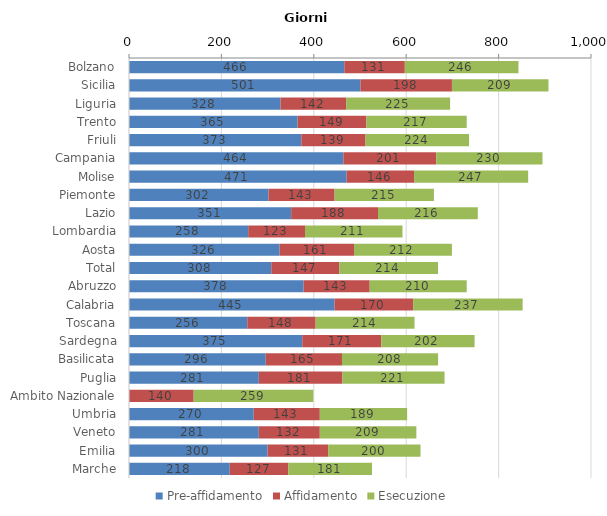
| Category | Pre-affidamento | Affidamento | Esecuzione |
|---|---|---|---|
| Bolzano | 466 | 131 | 246 |
| Sicilia | 501 | 198 | 209 |
| Liguria | 328 | 142 | 225 |
| Trento | 365 | 149 | 217 |
| Friuli | 373 | 139 | 224 |
| Campania | 464 | 201 | 230 |
| Molise | 471 | 146 | 247 |
| Piemonte | 302 | 143 | 215 |
| Lazio | 351 | 188 | 216 |
| Lombardia | 258 | 123 | 211 |
| Aosta | 326 | 161 | 212 |
| Total | 308 | 147 | 214 |
| Abruzzo | 378 | 143 | 210 |
| Calabria | 445 | 170 | 237 |
| Toscana | 256 | 148 | 214 |
| Sardegna | 375 | 171 | 202 |
| Basilicata | 296 | 165 | 208 |
| Puglia | 281 | 181 | 221 |
| Ambito Nazionale | 0 | 140 | 259 |
| Umbria | 270 | 143 | 189 |
| Veneto | 281 | 132 | 209 |
| Emilia | 300 | 131 | 200 |
| Marche | 218 | 127 | 181 |